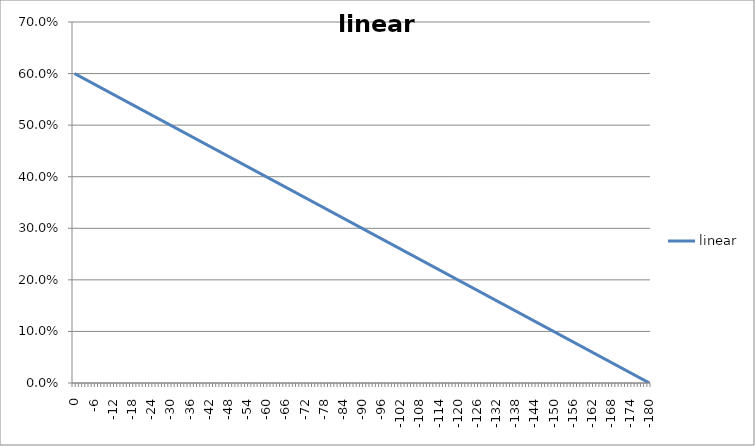
| Category | linear |
|---|---|
| 0.0 | 0.6 |
| -1.0 | 0.597 |
| -2.0 | 0.593 |
| -3.0 | 0.59 |
| -4.0 | 0.587 |
| -5.0 | 0.583 |
| -6.0 | 0.58 |
| -7.0 | 0.577 |
| -8.0 | 0.573 |
| -9.0 | 0.57 |
| -10.0 | 0.567 |
| -11.0 | 0.563 |
| -12.0 | 0.56 |
| -13.0 | 0.557 |
| -14.0 | 0.553 |
| -15.0 | 0.55 |
| -16.0 | 0.547 |
| -17.0 | 0.543 |
| -18.0 | 0.54 |
| -19.0 | 0.537 |
| -20.0 | 0.533 |
| -21.0 | 0.53 |
| -22.0 | 0.527 |
| -23.0 | 0.523 |
| -24.0 | 0.52 |
| -25.0 | 0.517 |
| -26.0 | 0.513 |
| -27.0 | 0.51 |
| -28.0 | 0.507 |
| -29.0 | 0.503 |
| -30.0 | 0.5 |
| -31.0 | 0.497 |
| -32.0 | 0.493 |
| -33.0 | 0.49 |
| -34.0 | 0.487 |
| -35.0 | 0.483 |
| -36.0 | 0.48 |
| -37.0 | 0.477 |
| -38.0 | 0.473 |
| -39.0 | 0.47 |
| -40.0 | 0.467 |
| -41.0 | 0.463 |
| -42.0 | 0.46 |
| -43.0 | 0.457 |
| -44.0 | 0.453 |
| -45.0 | 0.45 |
| -46.0 | 0.447 |
| -47.0 | 0.443 |
| -48.0 | 0.44 |
| -49.0 | 0.437 |
| -50.0 | 0.433 |
| -51.0 | 0.43 |
| -52.0 | 0.427 |
| -53.0 | 0.423 |
| -54.0 | 0.42 |
| -55.0 | 0.417 |
| -56.0 | 0.413 |
| -57.0 | 0.41 |
| -58.0 | 0.407 |
| -59.0 | 0.403 |
| -60.0 | 0.4 |
| -61.0 | 0.397 |
| -62.0 | 0.393 |
| -63.0 | 0.39 |
| -64.0 | 0.387 |
| -65.0 | 0.383 |
| -66.0 | 0.38 |
| -67.0 | 0.377 |
| -68.0 | 0.373 |
| -69.0 | 0.37 |
| -70.0 | 0.367 |
| -71.0 | 0.363 |
| -72.0 | 0.36 |
| -73.0 | 0.357 |
| -74.0 | 0.353 |
| -75.0 | 0.35 |
| -76.0 | 0.347 |
| -77.0 | 0.343 |
| -78.0 | 0.34 |
| -79.0 | 0.337 |
| -80.0 | 0.333 |
| -81.0 | 0.33 |
| -82.0 | 0.327 |
| -83.0 | 0.323 |
| -84.0 | 0.32 |
| -85.0 | 0.317 |
| -86.0 | 0.313 |
| -87.0 | 0.31 |
| -88.0 | 0.307 |
| -89.0 | 0.303 |
| -90.0 | 0.3 |
| -91.0 | 0.297 |
| -92.0 | 0.293 |
| -93.0 | 0.29 |
| -94.0 | 0.287 |
| -95.0 | 0.283 |
| -96.0 | 0.28 |
| -97.0 | 0.277 |
| -98.0 | 0.273 |
| -99.0 | 0.27 |
| -100.0 | 0.267 |
| -101.0 | 0.263 |
| -102.0 | 0.26 |
| -103.0 | 0.257 |
| -104.0 | 0.253 |
| -105.0 | 0.25 |
| -106.0 | 0.247 |
| -107.0 | 0.243 |
| -108.0 | 0.24 |
| -109.0 | 0.237 |
| -110.0 | 0.233 |
| -111.0 | 0.23 |
| -112.0 | 0.227 |
| -113.0 | 0.223 |
| -114.0 | 0.22 |
| -115.0 | 0.217 |
| -116.0 | 0.213 |
| -117.0 | 0.21 |
| -118.0 | 0.207 |
| -119.0 | 0.203 |
| -120.0 | 0.2 |
| -121.0 | 0.197 |
| -122.0 | 0.193 |
| -123.0 | 0.19 |
| -124.0 | 0.187 |
| -125.0 | 0.183 |
| -126.0 | 0.18 |
| -127.0 | 0.177 |
| -128.0 | 0.173 |
| -129.0 | 0.17 |
| -130.0 | 0.167 |
| -131.0 | 0.163 |
| -132.0 | 0.16 |
| -133.0 | 0.157 |
| -134.0 | 0.153 |
| -135.0 | 0.15 |
| -136.0 | 0.147 |
| -137.0 | 0.143 |
| -138.0 | 0.14 |
| -139.0 | 0.137 |
| -140.0 | 0.133 |
| -141.0 | 0.13 |
| -142.0 | 0.127 |
| -143.0 | 0.123 |
| -144.0 | 0.12 |
| -145.0 | 0.117 |
| -146.0 | 0.113 |
| -147.0 | 0.11 |
| -148.0 | 0.107 |
| -149.0 | 0.103 |
| -150.0 | 0.1 |
| -151.0 | 0.097 |
| -152.0 | 0.093 |
| -153.0 | 0.09 |
| -154.0 | 0.087 |
| -155.0 | 0.083 |
| -156.0 | 0.08 |
| -157.0 | 0.077 |
| -158.0 | 0.073 |
| -159.0 | 0.07 |
| -160.0 | 0.067 |
| -161.0 | 0.063 |
| -162.0 | 0.06 |
| -163.0 | 0.057 |
| -164.0 | 0.053 |
| -165.0 | 0.05 |
| -166.0 | 0.047 |
| -167.0 | 0.043 |
| -168.0 | 0.04 |
| -169.0 | 0.037 |
| -170.0 | 0.033 |
| -171.0 | 0.03 |
| -172.0 | 0.027 |
| -173.0 | 0.023 |
| -174.0 | 0.02 |
| -175.0 | 0.017 |
| -176.0 | 0.013 |
| -177.0 | 0.01 |
| -178.0 | 0.007 |
| -179.0 | 0.003 |
| -180.0 | 0 |